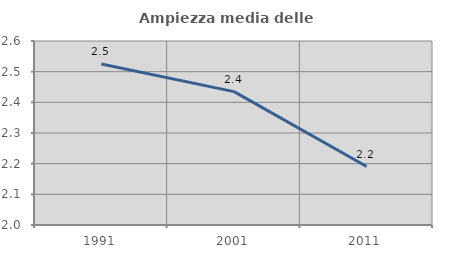
| Category | Ampiezza media delle famiglie |
|---|---|
| 1991.0 | 2.525 |
| 2001.0 | 2.435 |
| 2011.0 | 2.191 |